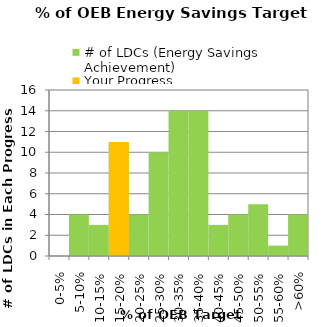
| Category | # of LDCs (Energy Savings Achievement) | Your Progress |
|---|---|---|
| 0-5% | 0 | 0 |
| 5-10% | 4 | 0 |
| 10-15% | 3 | 0 |
| 15-20% | 11 | 11 |
| 20-25% | 4 | 0 |
| 25-30% | 10 | 0 |
| 30-35% | 14 | 0 |
| 35-40% | 14 | 0 |
| 40-45% | 3 | 0 |
| 45-50% | 4 | 0 |
| 50-55% | 5 | 0 |
| 55-60% | 1 | 0 |
| >60% | 4 | 0 |